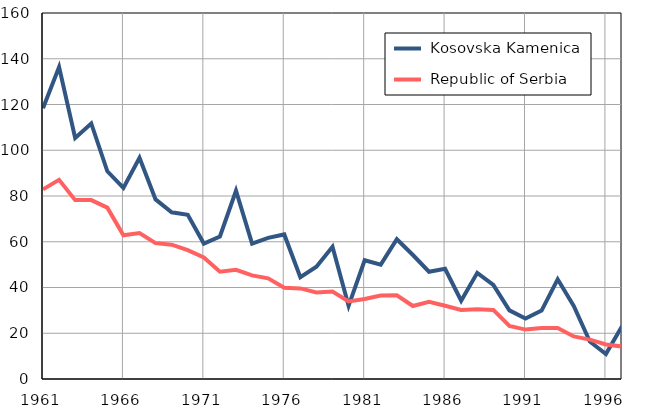
| Category |  Kosovska Kamenica |  Republic of Serbia |
|---|---|---|
| 1961.0 | 118.4 | 82.9 |
| 1962.0 | 136.4 | 87.1 |
| 1963.0 | 105.4 | 78.2 |
| 1964.0 | 111.7 | 78.2 |
| 1965.0 | 90.8 | 74.9 |
| 1966.0 | 83.5 | 62.8 |
| 1967.0 | 96.7 | 63.8 |
| 1968.0 | 78.5 | 59.4 |
| 1969.0 | 72.9 | 58.7 |
| 1970.0 | 71.8 | 56.3 |
| 1971.0 | 59.2 | 53.1 |
| 1972.0 | 62.3 | 46.9 |
| 1973.0 | 82.3 | 47.7 |
| 1974.0 | 59.2 | 45.3 |
| 1975.0 | 61.7 | 44 |
| 1976.0 | 63.2 | 39.9 |
| 1977.0 | 44.5 | 39.6 |
| 1978.0 | 49.1 | 37.8 |
| 1979.0 | 57.8 | 38.2 |
| 1980.0 | 32 | 33.9 |
| 1981.0 | 51.9 | 35 |
| 1982.0 | 50 | 36.5 |
| 1983.0 | 61.1 | 36.6 |
| 1984.0 | 54.2 | 31.9 |
| 1985.0 | 46.9 | 33.7 |
| 1986.0 | 48.2 | 32 |
| 1987.0 | 34.2 | 30.2 |
| 1988.0 | 46.4 | 30.5 |
| 1989.0 | 41.1 | 30.2 |
| 1990.0 | 30 | 23.2 |
| 1991.0 | 26.4 | 21.6 |
| 1992.0 | 29.9 | 22.3 |
| 1993.0 | 43.6 | 22.3 |
| 1994.0 | 31.9 | 18.6 |
| 1995.0 | 16.4 | 17.2 |
| 1996.0 | 10.9 | 15.1 |
| 1997.0 | 23.1 | 14.2 |